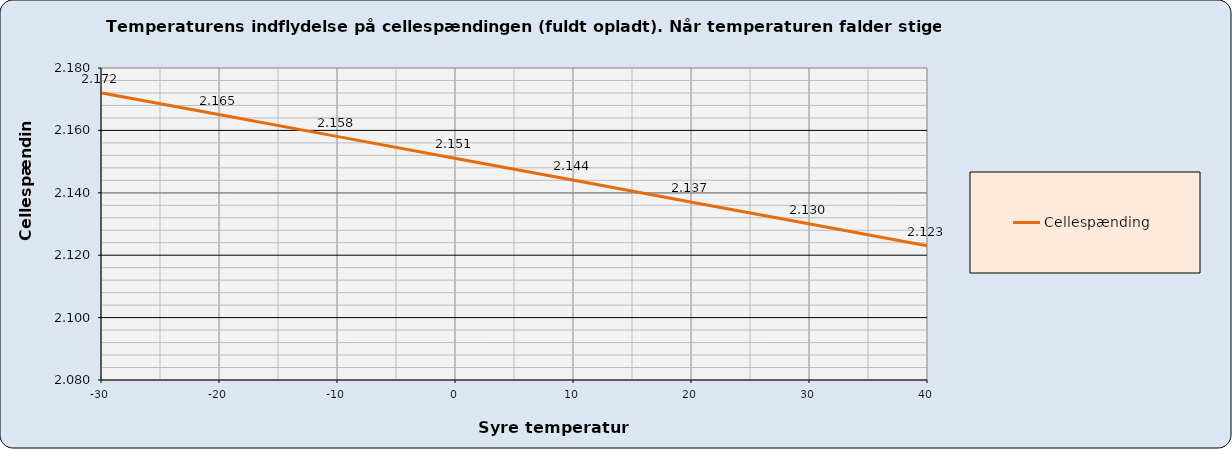
| Category | Cellespænding |
|---|---|
| -30.0 | 2.172 |
| -20.0 | 2.165 |
| -10.0 | 2.158 |
| 0.0 | 2.151 |
| 10.0 | 2.144 |
| 20.0 | 2.137 |
| 30.0 | 2.13 |
| 40.0 | 2.123 |